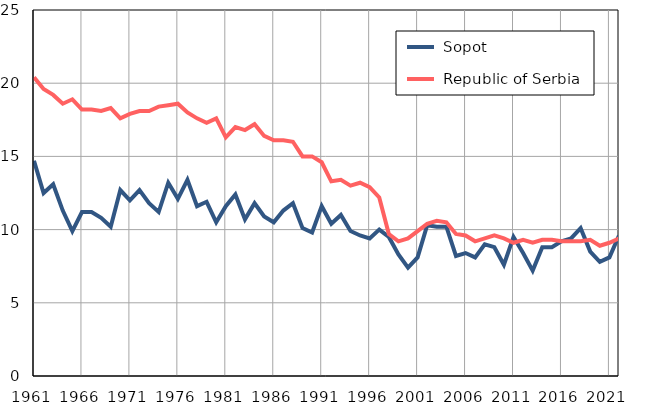
| Category |  Sopot |  Republic of Serbia |
|---|---|---|
| 1961.0 | 14.7 | 20.4 |
| 1962.0 | 12.5 | 19.6 |
| 1963.0 | 13.1 | 19.2 |
| 1964.0 | 11.3 | 18.6 |
| 1965.0 | 9.9 | 18.9 |
| 1966.0 | 11.2 | 18.2 |
| 1967.0 | 11.2 | 18.2 |
| 1968.0 | 10.8 | 18.1 |
| 1969.0 | 10.2 | 18.3 |
| 1970.0 | 12.7 | 17.6 |
| 1971.0 | 12 | 17.9 |
| 1972.0 | 12.7 | 18.1 |
| 1973.0 | 11.8 | 18.1 |
| 1974.0 | 11.2 | 18.4 |
| 1975.0 | 13.2 | 18.5 |
| 1976.0 | 12.1 | 18.6 |
| 1977.0 | 13.4 | 18 |
| 1978.0 | 11.6 | 17.6 |
| 1979.0 | 11.9 | 17.3 |
| 1980.0 | 10.5 | 17.6 |
| 1981.0 | 11.6 | 16.3 |
| 1982.0 | 12.4 | 17 |
| 1983.0 | 10.7 | 16.8 |
| 1984.0 | 11.8 | 17.2 |
| 1985.0 | 10.9 | 16.4 |
| 1986.0 | 10.5 | 16.1 |
| 1987.0 | 11.3 | 16.1 |
| 1988.0 | 11.8 | 16 |
| 1989.0 | 10.1 | 15 |
| 1990.0 | 9.8 | 15 |
| 1991.0 | 11.6 | 14.6 |
| 1992.0 | 10.4 | 13.3 |
| 1993.0 | 11 | 13.4 |
| 1994.0 | 9.9 | 13 |
| 1995.0 | 9.6 | 13.2 |
| 1996.0 | 9.4 | 12.9 |
| 1997.0 | 10 | 12.2 |
| 1998.0 | 9.5 | 9.7 |
| 1999.0 | 8.3 | 9.2 |
| 2000.0 | 7.4 | 9.4 |
| 2001.0 | 8.1 | 9.9 |
| 2002.0 | 10.3 | 10.4 |
| 2003.0 | 10.2 | 10.6 |
| 2004.0 | 10.2 | 10.5 |
| 2005.0 | 8.2 | 9.7 |
| 2006.0 | 8.4 | 9.6 |
| 2007.0 | 8.1 | 9.2 |
| 2008.0 | 9 | 9.4 |
| 2009.0 | 8.8 | 9.6 |
| 2010.0 | 7.6 | 9.4 |
| 2011.0 | 9.5 | 9.1 |
| 2012.0 | 8.4 | 9.3 |
| 2013.0 | 7.2 | 9.1 |
| 2014.0 | 8.8 | 9.3 |
| 2015.0 | 8.8 | 9.3 |
| 2016.0 | 9.2 | 9.2 |
| 2017.0 | 9.4 | 9.2 |
| 2018.0 | 10.1 | 9.2 |
| 2019.0 | 8.5 | 9.3 |
| 2020.0 | 7.8 | 8.9 |
| 2021.0 | 8.1 | 9.1 |
| 2022.0 | 9.6 | 9.4 |